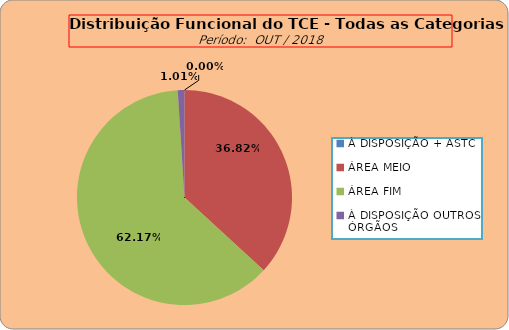
| Category | Series 0 |
|---|---|
| À DISPOSIÇÃO + ASTC | 0 |
| ÁREA MEIO | 183 |
| ÁREA FIM | 309 |
| À DISPOSIÇÃO OUTROS ÓRGÃOS | 5 |